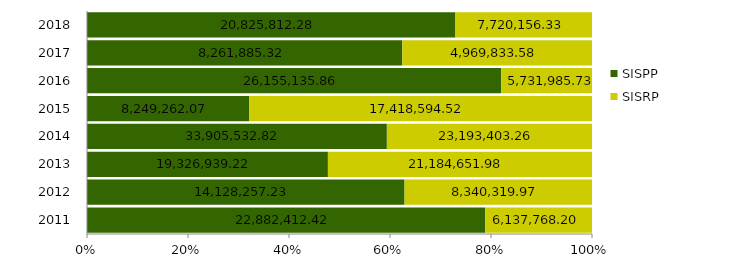
| Category | SISPP | SISRP |
|---|---|---|
| 2011.0 | 22882412.42 | 6137768.2 |
| 2012.0 | 14128257.23 | 8340319.97 |
| 2013.0 | 19326939.22 | 21184651.98 |
| 2014.0 | 33905532.82 | 23193403.26 |
| 2015.0 | 8249262.07 | 17418594.52 |
| 2016.0 | 26155135.86 | 5731985.73 |
| 2017.0 | 8261885.32 | 4969833.58 |
| 2018.0 | 20825812.28 | 7720156.33 |